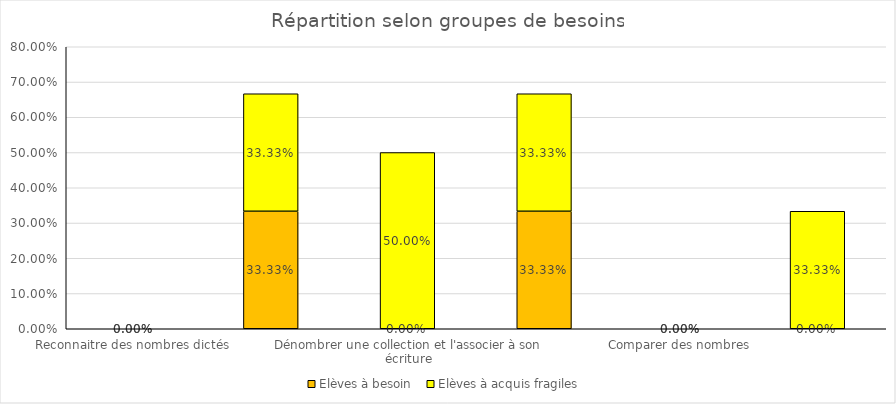
| Category | Elèves à besoin | Elèves à acquis fragiles |
|---|---|---|
| Reconnaitre des nombres dictés | 0 | 0 |
| Ecrire des nombres sous la dictée | 0.333 | 0.333 |
| Dénombrer une collection et l'associer à son écriture | 0 | 0.5 |
| Placer un nombre sur une ligne numérique | 0.333 | 0.333 |
| Comparer des nombres | 0 | 0 |
| Résoudre des problèmes | 0 | 0.333 |